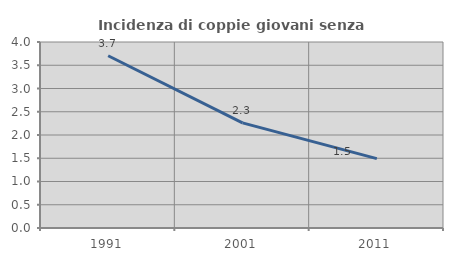
| Category | Incidenza di coppie giovani senza figli |
|---|---|
| 1991.0 | 3.704 |
| 2001.0 | 2.26 |
| 2011.0 | 1.493 |